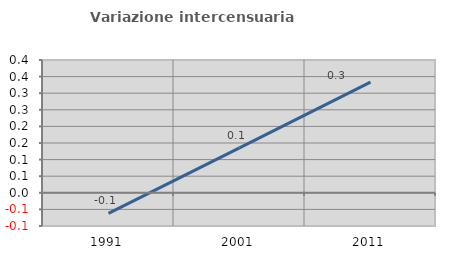
| Category | Variazione intercensuaria annua |
|---|---|
| 1991.0 | -0.062 |
| 2001.0 | 0.136 |
| 2011.0 | 0.333 |